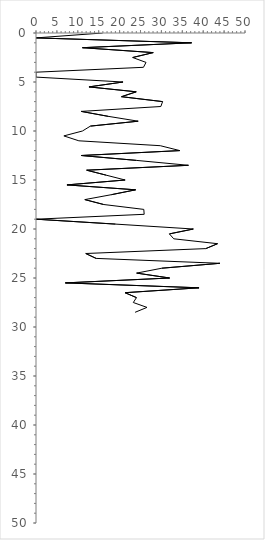
| Category | Series 0 |
|---|---|
| 15.935672514619883 | 0 |
| 0.0 | 0.5 |
| 37.22414181129778 | 1 |
| 11.111111111111112 | 1.5 |
| 28.044733044733047 | 2 |
| 23.12925170068027 | 2.5 |
| 26.320667284522703 | 3 |
| 25.707186544342505 | 3.5 |
| 0.0 | 4 |
| 0.0 | 4.5 |
| 20.82324455205811 | 5 |
| 12.674271229404306 | 5.5 |
| 23.979107312440643 | 6 |
| 20.454545454545457 | 6.5 |
| 30.286843419538357 | 7 |
| 29.865604778496763 | 7.5 |
| 10.822510822510822 | 8 |
| 17.222222222222225 | 8.5 |
| 24.444444444444446 | 9 |
| 13.02083333333333 | 9.5 |
| 11.111111111111112 | 10 |
| 6.666666666666667 | 10.5 |
| 10.256410256410257 | 11 |
| 29.735985985985987 | 11.5 |
| 34.409798467769484 | 12 |
| 10.822510822510822 | 12.5 |
| 24.031007751937988 | 13 |
| 36.47509578544061 | 13.5 |
| 12.121212121212123 | 14 |
| 16.73202614379085 | 14.5 |
| 21.323695504856563 | 15 |
| 7.407407407407407 | 15.5 |
| 23.83720930232558 | 16 |
| 18.018018018018015 | 16.5 |
| 11.680911680911679 | 17 |
| 16.19047619047619 | 17.5 |
| 25.791245791245796 | 18 |
| 25.87845669812883 | 18.5 |
| 0.0 | 19 |
| 19.023477578610656 | 19.5 |
| 37.63971828823211 | 20 |
| 31.90961487079659 | 20.5 |
| 32.95454545454546 | 21 |
| 43.43840349763767 | 21.5 |
| 40.62810574438481 | 22 |
| 11.904761904761903 | 22.5 |
| 14.37587657784011 | 23 |
| 43.99463994375267 | 23.5 |
| 30.12345679012346 | 24 |
| 24.074074074074076 | 24.5 |
| 31.960404155041687 | 25 |
| 7.017543859649123 | 25.5 |
| 39.003367003367 | 26 |
| 21.296296296296294 | 26.5 |
| 24.03312403312403 | 27 |
| 23.280423280423282 | 27.5 |
| 26.548269581056463 | 28 |
| 23.703703703703706 | 28.5 |